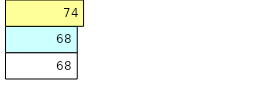
| Category | Total Standouts | Total Recd | Total Tipsters |
|---|---|---|---|
| 0 | 68 | 68 | 74 |